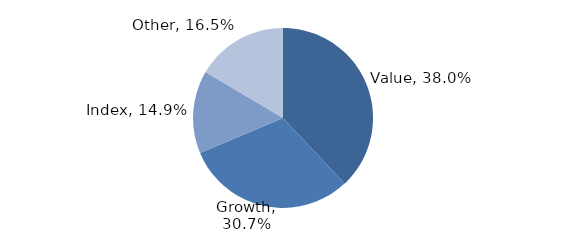
| Category | Investment Style |
|---|---|
| Value | 0.38 |
| Growth | 0.307 |
| Index | 0.149 |
| Other | 0.165 |